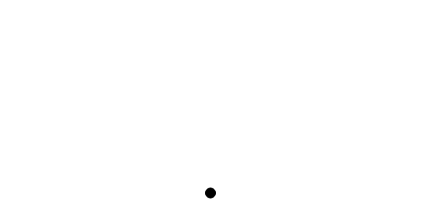
| Category | Agulha |
|---|---|
| 0.0 | 0 |
| 0.0 | 0 |